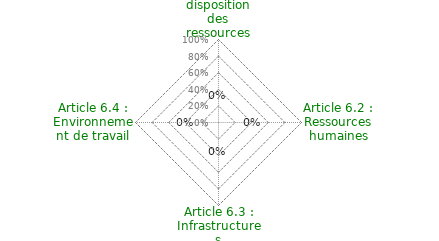
| Category | Article 6 : Management des ressources |
|---|---|
| Article 6.1 : Mise à disposition des ressources | 0 |
| Article 6.2 : Ressources humaines | 0 |
| Article 6.3 : Infrastructures | 0 |
| Article 6.4 : Environnement de travail | 0 |